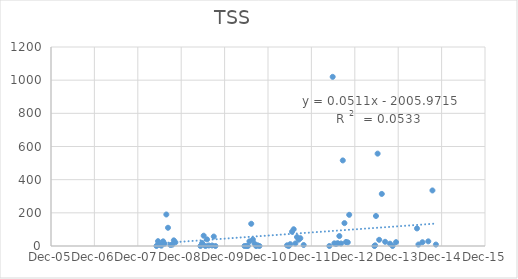
| Category | Series 0 |
|---|---|
| 39577.0 | 0 |
| 39590.0 | 29 |
| 39604.0 | 8 |
| 39618.0 | 2 |
| 39633.0 | 28 |
| 39645.0 | 14 |
| 39660.0 | 190 |
| 39674.0 | 110 |
| 39695.0 | 6 |
| 39710.0 | 8 |
| 39723.0 | 34 |
| 39736.0 | 22 |
| 39947.0 | 0 |
| 39961.0 | 18 |
| 39974.0 | 62 |
| 39989.0 | 0 |
| 40002.0 | 40 |
| 40017.0 | 3 |
| 40045.0 | 3 |
| 40059.0 | 57 |
| 40073.0 | 0 |
| 40317.0 | 0 |
| 40332.0 | 0 |
| 40346.0 | 0 |
| 40359.0 | 28 |
| 40374.0 | 134 |
| 40388.0 | 39 |
| 40402.0 | 14 |
| 40415.0 | 0 |
| 40429.0 | 4 |
| 40443.0 | 0 |
| 40675.0 | 4 |
| 40689.0 | 0 |
| 40702.0 | 11 |
| 40717.0 | 86 |
| 40731.0 | 101 |
| 40745.0 | 15 |
| 40759.0 | 54 |
| 40773.0 | 38 |
| 40787.0 | 47 |
| 40815.0 | 6 |
| 41031.0 | 0 |
| 41059.0 | 1020 |
| 41073.0 | 16 |
| 41087.0 | 12 |
| 41101.0 | 17 |
| 41115.0 | 60 |
| 41129.0 | 15 |
| 41144.0 | 516 |
| 41158.0 | 138 |
| 41171.0 | 24 |
| 41186.0 | 22 |
| 41198.0 | 188 |
| 41410.0 | 0 |
| 41416.0 | 4 |
| 41423.0 | 181 |
| 41437.0 | 557 |
| 41450.0 | 37.3 |
| 41472.0 | 314 |
| 41500.0 | 25.3 |
| 41541.0 | 14 |
| 41563.0 | 0 |
| 41592.0 | 23.3 |
| 41768.0 | 106 |
| 41780.0 | 8.7 |
| 41814.0 | 22.7 |
| 41863.0 | 28 |
| 41898.0 | 335 |
| 41927.0 | 8.7 |